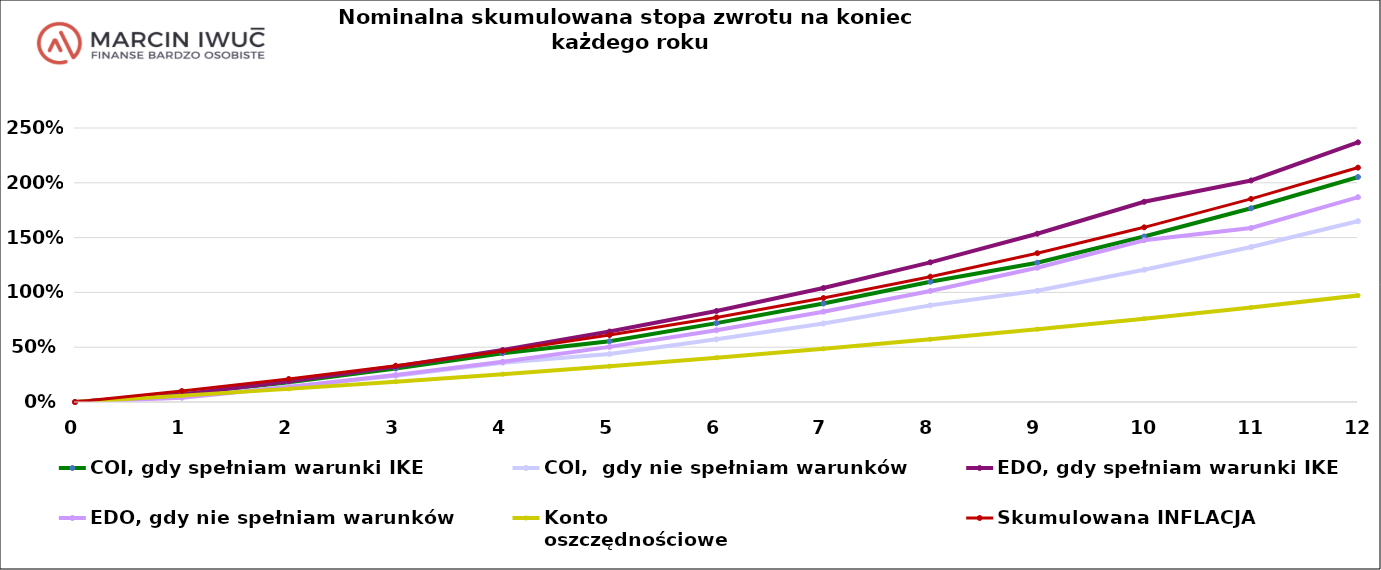
| Category | COI, gdy spełniam warunki IKE | COI,  gdy nie spełniam warunków | EDO, gdy spełniam warunki IKE | EDO, gdy nie spełniam warunków | Konto
oszczędnościowe | Skumulowana INFLACJA |
|---|---|---|---|---|---|---|
| 0.0 | 0 | 0 | 0 | 0 | 0 | 0 |
| 1.0 | 0.066 | 0.047 | 0.068 | 0.039 | 0.058 | 0.1 |
| 2.0 | 0.18 | 0.14 | 0.189 | 0.136 | 0.12 | 0.21 |
| 3.0 | 0.306 | 0.24 | 0.324 | 0.245 | 0.185 | 0.331 |
| 4.0 | 0.445 | 0.358 | 0.475 | 0.367 | 0.254 | 0.464 |
| 5.0 | 0.554 | 0.439 | 0.643 | 0.503 | 0.327 | 0.611 |
| 6.0 | 0.719 | 0.572 | 0.831 | 0.655 | 0.404 | 0.772 |
| 7.0 | 0.899 | 0.716 | 1.04 | 0.824 | 0.486 | 0.949 |
| 8.0 | 1.097 | 0.882 | 1.274 | 1.013 | 0.572 | 1.144 |
| 9.0 | 1.271 | 1.014 | 1.535 | 1.224 | 0.664 | 1.358 |
| 10.0 | 1.51 | 1.207 | 1.827 | 1.476 | 0.761 | 1.594 |
| 11.0 | 1.768 | 1.414 | 2.021 | 1.587 | 0.863 | 1.853 |
| 12.0 | 2.053 | 1.65 | 2.369 | 1.869 | 0.972 | 2.138 |